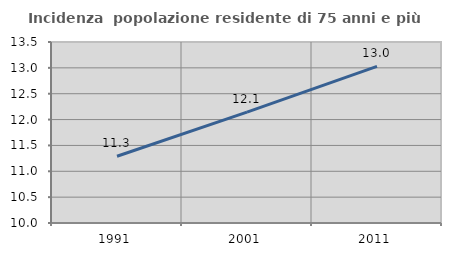
| Category | Incidenza  popolazione residente di 75 anni e più |
|---|---|
| 1991.0 | 11.29 |
| 2001.0 | 12.145 |
| 2011.0 | 13.03 |